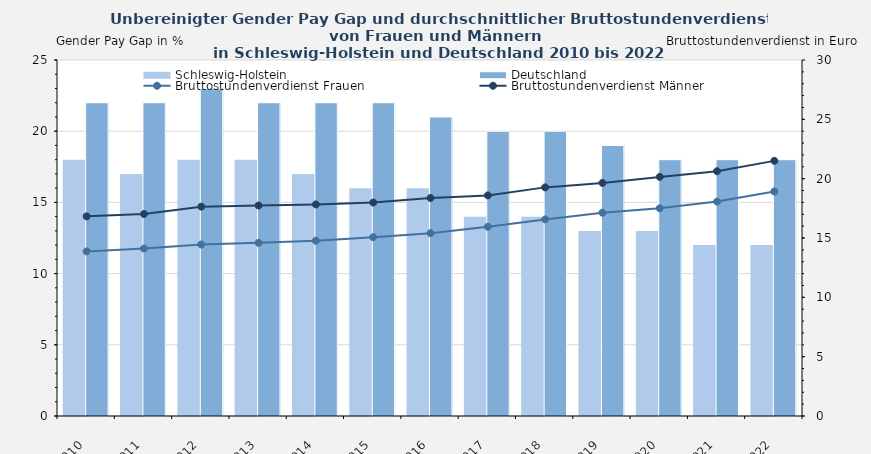
| Category | Schleswig-Holstein | Deutschland |
|---|---|---|
| 2010.0 | 18 | 22 |
| 2011.0 | 17 | 22 |
| 2012.0 | 18 | 23 |
| 2013.0 | 18 | 22 |
| 2014.0 | 17 | 22 |
| 2015.0 | 16 | 22 |
| 2016.0 | 16 | 21 |
| 2017.0 | 14 | 20 |
| 2018.0 | 14 | 20 |
| 2019.0 | 13 | 19 |
| 2020.0 | 13 | 18 |
| 2021.0 | 12 | 18 |
| 2022.0 | 12 | 18 |